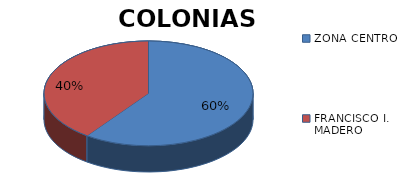
| Category | FRANCISCO I. MADERO 2 |
|---|---|
| ZONA CENTRO | 3 |
| FRANCISCO I. MADERO | 2 |